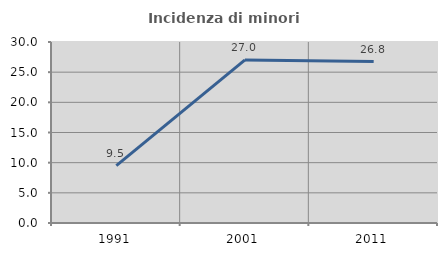
| Category | Incidenza di minori stranieri |
|---|---|
| 1991.0 | 9.524 |
| 2001.0 | 27.027 |
| 2011.0 | 26.768 |